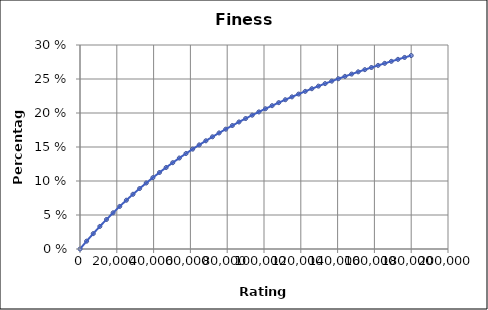
| Category | Finesse |
|---|---|
| 0.0 | 0 |
| 3600.0 | 0.012 |
| 7200.0 | 0.023 |
| 10800.0 | 0.033 |
| 14400.0 | 0.043 |
| 18000.0 | 0.053 |
| 21600.0 | 0.063 |
| 25200.0 | 0.072 |
| 28800.0 | 0.08 |
| 32400.0 | 0.089 |
| 36000.0 | 0.097 |
| 39600.0 | 0.105 |
| 43200.0 | 0.112 |
| 46800.0 | 0.12 |
| 50400.0 | 0.127 |
| 54000.0 | 0.134 |
| 57600.0 | 0.14 |
| 61200.0 | 0.147 |
| 64800.0 | 0.153 |
| 68400.0 | 0.159 |
| 72000.0 | 0.165 |
| 75600.0 | 0.171 |
| 79200.0 | 0.176 |
| 82800.0 | 0.182 |
| 86400.0 | 0.187 |
| 90000.0 | 0.192 |
| 93600.0 | 0.197 |
| 97200.0 | 0.202 |
| 100800.0 | 0.206 |
| 104400.0 | 0.211 |
| 108000.0 | 0.215 |
| 111600.0 | 0.22 |
| 115200.0 | 0.224 |
| 118800.0 | 0.228 |
| 122400.0 | 0.232 |
| 126000.0 | 0.236 |
| 129600.0 | 0.24 |
| 133200.0 | 0.243 |
| 136800.0 | 0.247 |
| 140400.0 | 0.25 |
| 144000.0 | 0.254 |
| 147600.0 | 0.257 |
| 151200.0 | 0.261 |
| 154800.0 | 0.264 |
| 158400.0 | 0.267 |
| 162000.0 | 0.27 |
| 165600.0 | 0.273 |
| 169200.0 | 0.276 |
| 172800.0 | 0.279 |
| 176400.0 | 0.282 |
| 180000.0 | 0.284 |